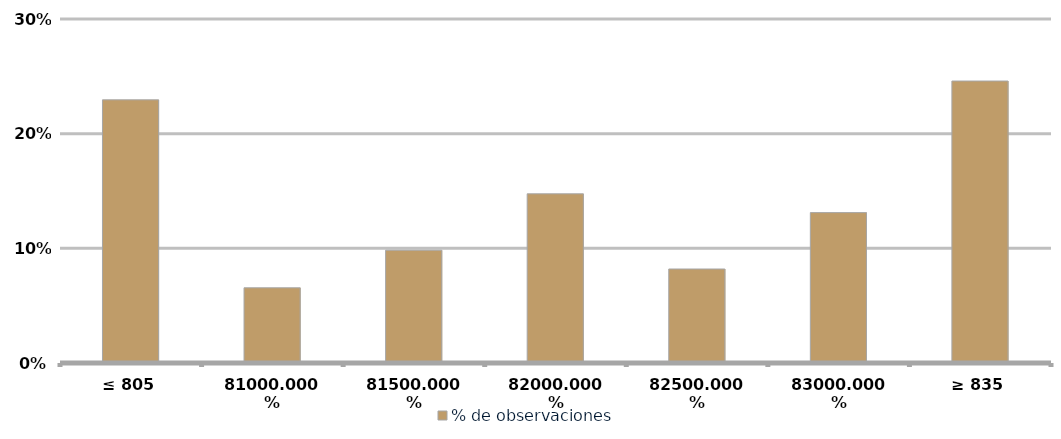
| Category | % de observaciones  |
|---|---|
| ≤ 805 | 0.23 |
| 810 | 0.066 |
| 815 | 0.098 |
| 820 | 0.148 |
| 825 | 0.082 |
| 830 | 0.131 |
| ≥ 835 | 0.246 |